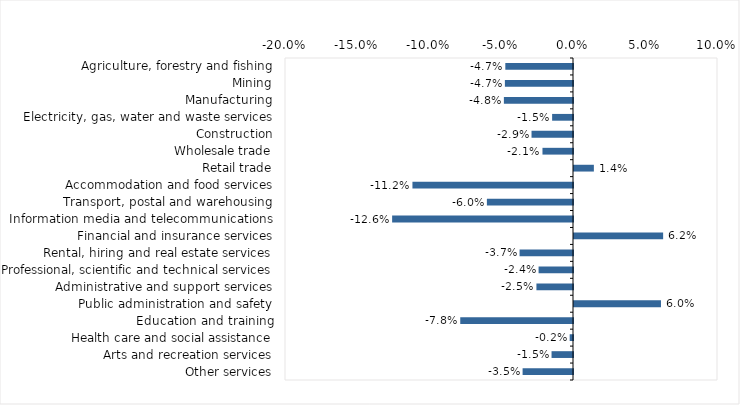
| Category | This week |
|---|---|
| Agriculture, forestry and fishing | -0.047 |
| Mining | -0.047 |
| Manufacturing | -0.048 |
| Electricity, gas, water and waste services | -0.014 |
| Construction | -0.029 |
| Wholesale trade | -0.021 |
| Retail trade | 0.014 |
| Accommodation and food services | -0.112 |
| Transport, postal and warehousing | -0.06 |
| Information media and telecommunications | -0.126 |
| Financial and insurance services | 0.062 |
| Rental, hiring and real estate services | -0.037 |
| Professional, scientific and technical services | -0.024 |
| Administrative and support services | -0.025 |
| Public administration and safety | 0.06 |
| Education and training | -0.078 |
| Health care and social assistance | -0.002 |
| Arts and recreation services | -0.015 |
| Other services | -0.035 |